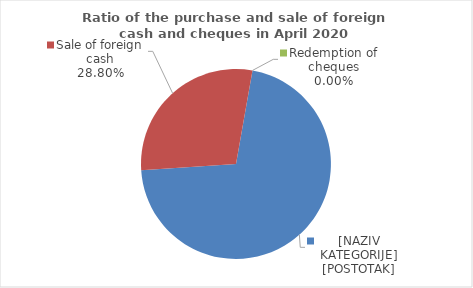
| Category | Series 0 |
|---|---|
| Purchase of foreign cash | 71.195 |
| Sale of foreign cash | 28.805 |
| Redemption of cheques | 0 |